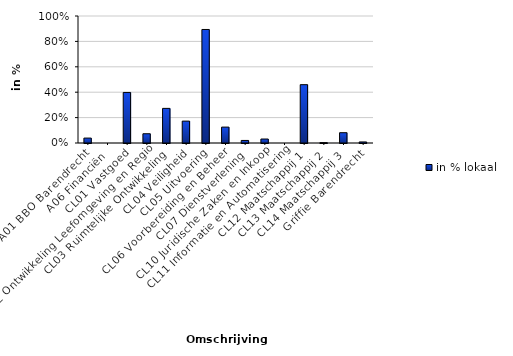
| Category | in % lokaal |
|---|---|
| A01 BBO Barendrecht | 0.039 |
| A06 Financiën | 0 |
| CL01 Vastgoed | 0.398 |
| CL02 Ontwikkeling Leefomgeving en Regio | 0.073 |
| CL03 Ruimtelijke Ontwikkeling | 0.273 |
| CL04 Veiligheid | 0.172 |
| CL05 Uitvoering | 0.894 |
| CL06 Voorbereiding en Beheer | 0.125 |
| CL07 Dienstverlening | 0.02 |
| CL10 Juridische Zaken en Inkoop | 0.031 |
| CL11 Informatie en Automatisering | 0 |
| CL12 Maatschappij 1 | 0.459 |
| CL13 Maatschappij 2 | 0.003 |
| CL14 Maatschappij 3 | 0.081 |
| Griffie Barendrecht | 0.008 |